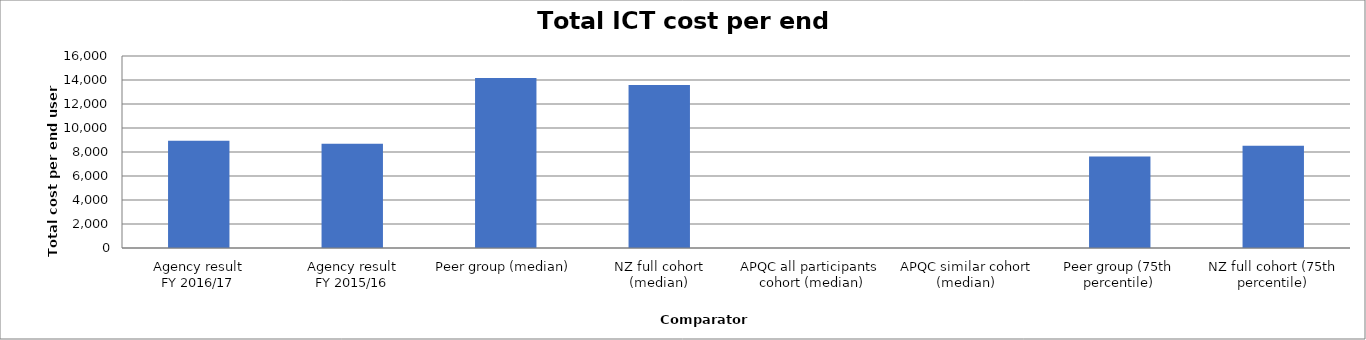
| Category | Result |
|---|---|
| Agency result
FY 2016/17 | 8941.105 |
| Agency result
FY 2015/16 | 8682.058 |
| Peer group (median) | 14172.597 |
| NZ full cohort (median) | 13587.245 |
| APQC all participants 
cohort (median) | 0 |
| APQC similar cohort (median) | 0 |
| Peer group (75th percentile) | 7626.003 |
| NZ full cohort (75th percentile) | 8523.983 |